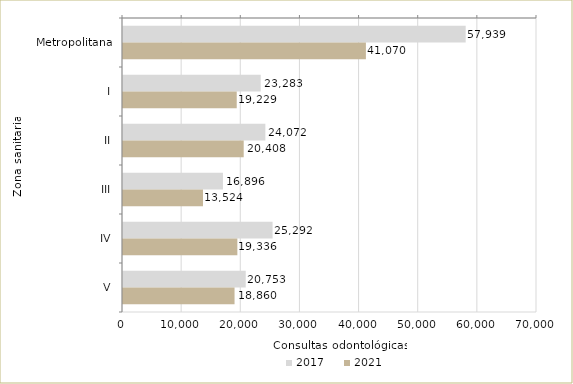
| Category | 2017 | 2021 |
|---|---|---|
| Metropolitana | 57939 | 41070 |
| I | 23283 | 19229 |
| II | 24072 | 20408 |
| III | 16896 | 13524 |
| IV | 25292 | 19336 |
| V | 20753 | 18860 |